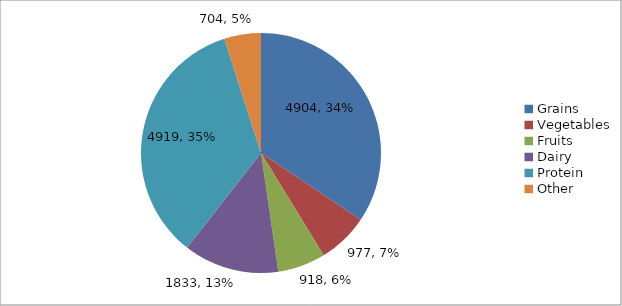
| Category | Series 0 |
|---|---|
| Grains | 4904 |
| Vegetables | 977 |
| Fruits | 918 |
| Dairy | 1833 |
| Protein | 4919 |
| Other | 704 |